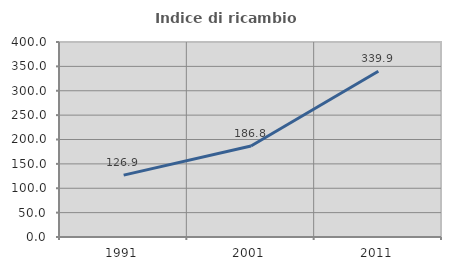
| Category | Indice di ricambio occupazionale  |
|---|---|
| 1991.0 | 126.865 |
| 2001.0 | 186.778 |
| 2011.0 | 339.889 |